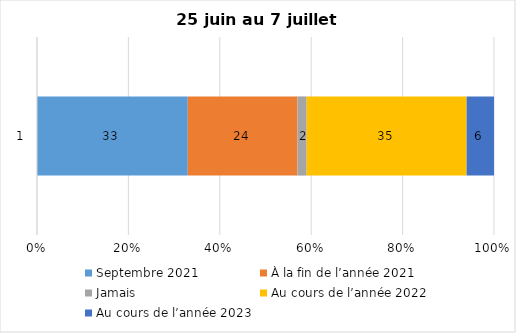
| Category | Septembre 2021 | À la fin de l’année 2021 | Jamais | Au cours de l’année 2022 | Au cours de l’année 2023 |
|---|---|---|---|---|---|
| 0 | 33 | 24 | 2 | 35 | 6 |